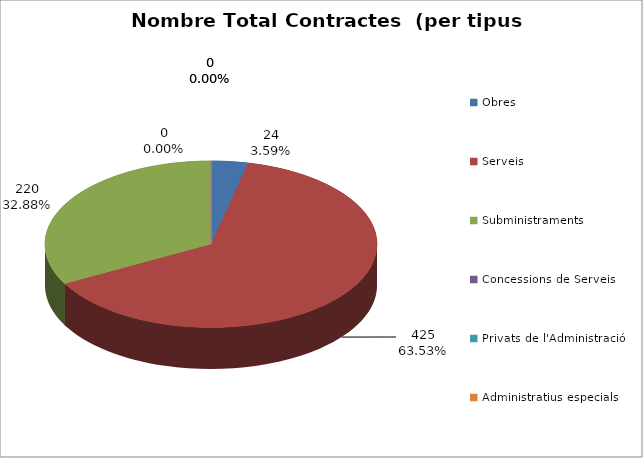
| Category | Nombre Total Contractes |
|---|---|
| Obres | 24 |
| Serveis | 425 |
| Subministraments | 220 |
| Concessions de Serveis | 0 |
| Privats de l'Administració | 0 |
| Administratius especials | 0 |